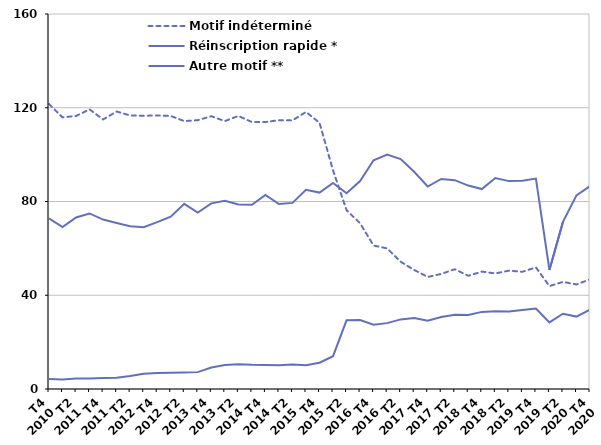
| Category | Motif indéterminé | Réinscription rapide * | Autre motif ** |
|---|---|---|---|
| T4
2010 | 121.6 | 72.8 | 4.3 |
| T1
2011 | 115.9 | 69.1 | 4.1 |
| T2
2011 | 116.5 | 73.2 | 4.5 |
| T3
2011 | 119.3 | 74.9 | 4.5 |
| T4
2011 | 115 | 72.3 | 4.7 |
| T1
2012 | 118.4 | 70.8 | 4.8 |
| T2
2012 | 116.7 | 69.4 | 5.5 |
| T3
2012 | 116.6 | 69 | 6.5 |
| T4
2012 | 116.7 | 71.2 | 6.8 |
| T1
2013 | 116.5 | 73.5 | 6.9 |
| T2
2013 | 114.3 | 79 | 7 |
| T3
2013 | 114.7 | 75.3 | 7.2 |
| T4
2013 | 116.4 | 79.2 | 9.2 |
| T1
2014 | 114.3 | 80.3 | 10.2 |
| T2
2014 | 116.5 | 78.7 | 10.6 |
| T3
2014 | 113.9 | 78.6 | 10.3 |
| T4
2014 | 113.9 | 82.8 | 10.2 |
| T1
2015 | 114.7 | 78.9 | 10.1 |
| T2
2015 | 114.6 | 79.4 | 10.4 |
| T3
2015 | 118.2 | 85 | 10.1 |
| T4
2015 | 113.6 | 83.8 | 11.2 |
| T1
2016 | 93.3 | 87.9 | 14 |
| T2
2016 | 76.3 | 83.5 | 29.3 |
| T3
2016 | 70.7 | 88.7 | 29.4 |
| T4
2016 | 61.2 | 97.6 | 27.4 |
| T1
2017 | 60 | 100 | 28.1 |
| T2
2017 | 54.3 | 98.1 | 29.7 |
| T3
2017 | 50.8 | 92.7 | 30.3 |
| T4
2017 | 47.8 | 86.4 | 29.1 |
| T1
2018 | 49.1 | 89.6 | 30.7 |
| T2
2018 | 51.1 | 89.1 | 31.7 |
| T3
2018 | 48.3 | 86.8 | 31.6 |
| T4
2018 | 50.1 | 85.3 | 32.9 |
| T1
2019 | 49.3 | 90 | 33.2 |
| T2
2019 | 50.5 | 88.7 | 33.1 |
| T3
2019 | 50 | 88.9 | 33.7 |
| T4
2019 | 51.9 | 89.8 | 34.3 |
| T1
2020 | 43.9 | 50.8 | 28.4 |
| T2
2020 | 45.7 | 71.3 | 32.1 |
| T3
2020 | 44.6 | 82.6 | 30.9 |
| T4
2020 | 46.8 | 86.6 | 33.9 |